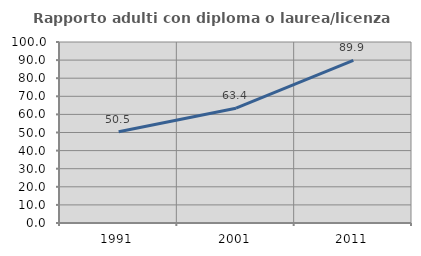
| Category | Rapporto adulti con diploma o laurea/licenza media  |
|---|---|
| 1991.0 | 50.467 |
| 2001.0 | 63.433 |
| 2011.0 | 89.899 |